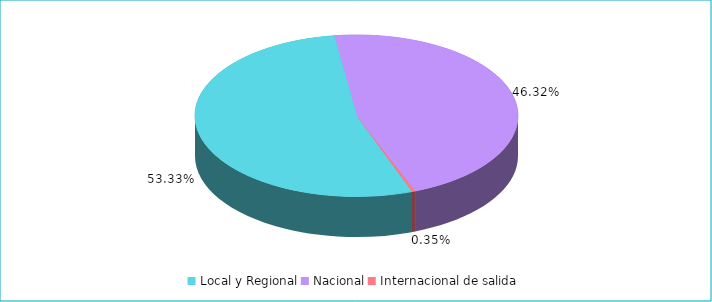
| Category | Series 1 | Series 0 |
|---|---|---|
| Local y Regional | 0.533 | 0.533 |
| Nacional | 0.463 | 0.463 |
| Internacional de salida | 0.003 | 0.003 |